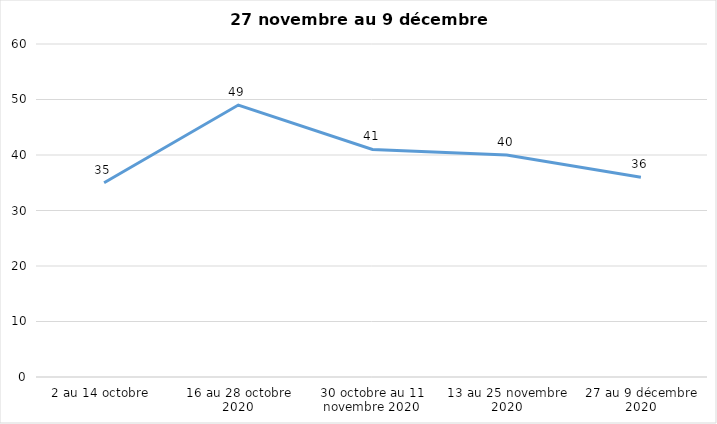
| Category | Series 0 |
|---|---|
| 2 au 14 octobre  | 35 |
| 16 au 28 octobre 2020 | 49 |
| 30 octobre au 11 novembre 2020 | 41 |
| 13 au 25 novembre 2020 | 40 |
| 27 au 9 décembre 2020 | 36 |